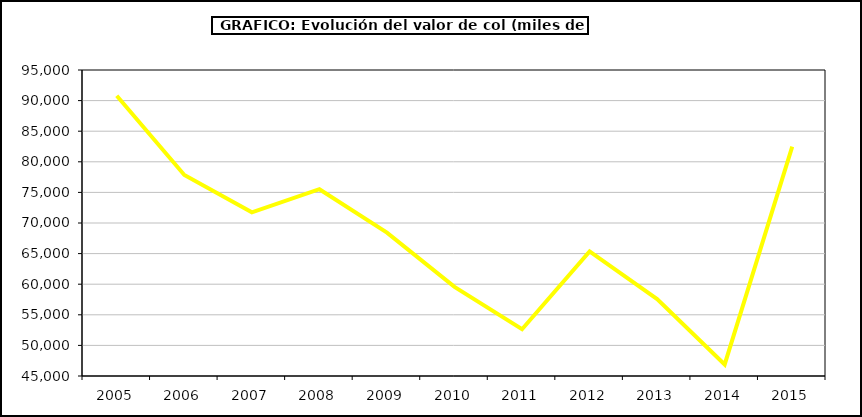
| Category | Valor |
|---|---|
| 2005.0 | 90804.966 |
| 2006.0 | 77851.364 |
| 2007.0 | 71751.927 |
| 2008.0 | 75521.403 |
| 2009.0 | 68429.192 |
| 2010.0 | 59556.292 |
| 2011.0 | 52642.369 |
| 2012.0 | 65369.978 |
| 2013.0 | 57574.735 |
| 2014.0 | 46884.616 |
| 2015.0 | 82468.9 |